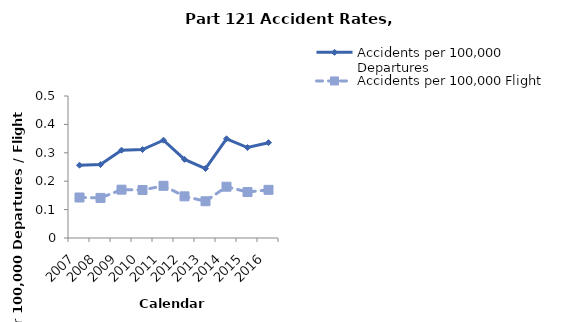
| Category | Accidents per 100,000 Departures | Accidents per 100,000 Flight Hours |
|---|---|---|
| 2007.0 | 0.256 | 0.143 |
| 2008.0 | 0.258 | 0.141 |
| 2009.0 | 0.309 | 0.17 |
| 2010.0 | 0.311 | 0.169 |
| 2011.0 | 0.344 | 0.184 |
| 2012.0 | 0.277 | 0.147 |
| 2013.0 | 0.245 | 0.129 |
| 2014.0 | 0.349 | 0.181 |
| 2015.0 | 0.319 | 0.162 |
| 2016.0 | 0.336 | 0.17 |